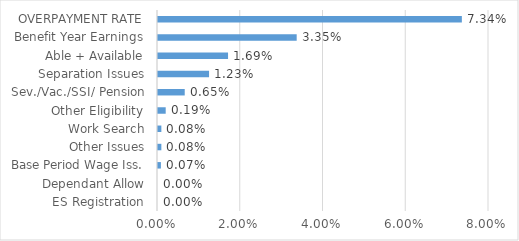
| Category | Series 0 |
|---|---|
| ES Registration | 0 |
| Dependant Allow | 0 |
| Base Period Wage Iss. | 0.001 |
| Other Issues | 0.001 |
| Work Search | 0.001 |
| Other Eligibility | 0.002 |
| Sev./Vac./SSI/ Pension | 0.006 |
| Separation Issues | 0.012 |
| Able + Available | 0.017 |
| Benefit Year Earnings | 0.034 |
| OVERPAYMENT RATE | 0.073 |